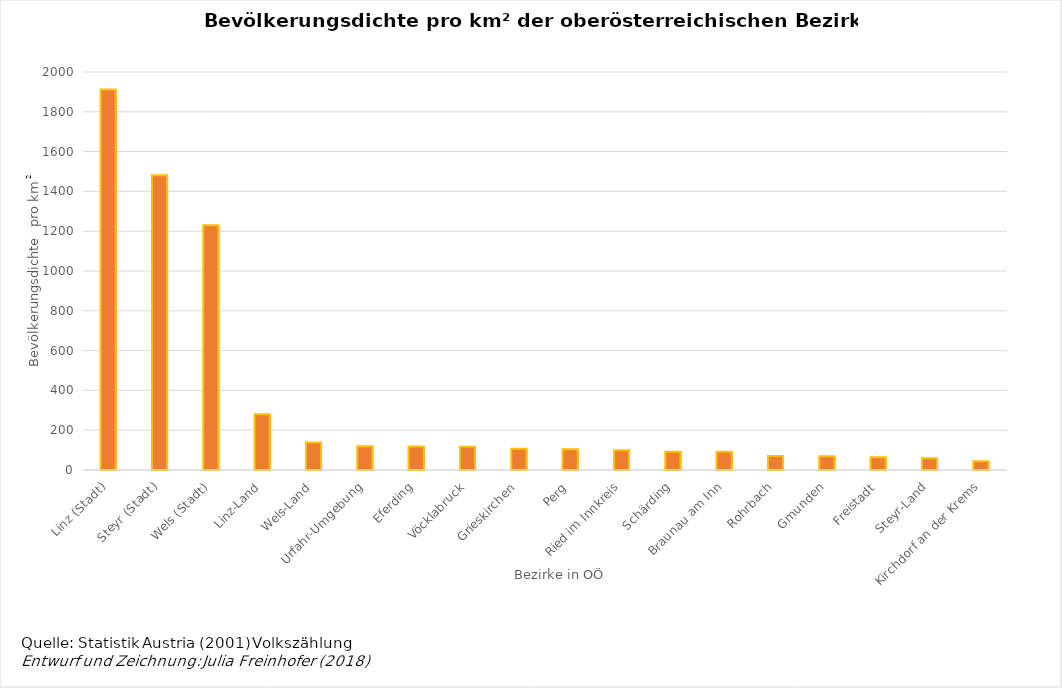
| Category | Dichte |
|---|---|
| Linz (Stadt) | 1911.898 |
| Steyr (Stadt) | 1481.175 |
| Wels (Stadt) | 1229.922 |
| Linz-Land | 280.411 |
| Wels-Land | 137.666 |
| Urfahr-Umgebung | 119.726 |
| Eferding | 118.392 |
| Vöcklabruck | 116.761 |
| Grieskirchen | 107.014 |
| Perg | 104.243 |
| Ried im Innkreis | 99.491 |
| Schärding | 92.153 |
| Braunau am Inn | 91.494 |
| Rohrbach | 69.943 |
| Gmunden | 69.352 |
| Freistadt | 64.403 |
| Steyr-Land | 59.289 |
| Kirchdorf an der Krems | 44.497 |